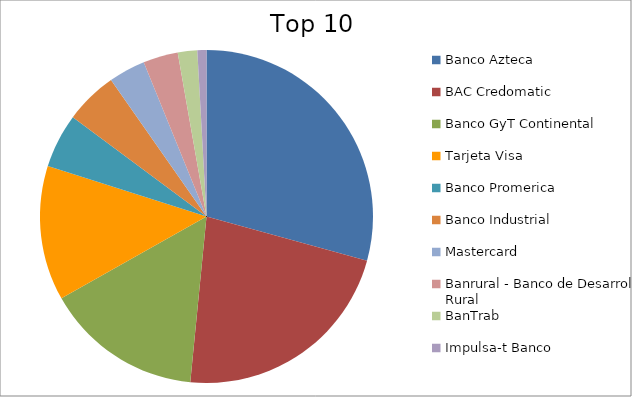
| Category | Series 0 |
|---|---|
| Banco Azteca | 29.27 |
| BAC Credomatic | 22.28 |
| Banco GyT Continental | 15.28 |
| Tarjeta Visa | 13.06 |
| Banco Promerica | 5.27 |
| Banco Industrial | 5.11 |
| Mastercard | 3.57 |
| Banrural - Banco de Desarrollo Rural | 3.38 |
| BanTrab | 1.89 |
| Impulsa-t Banco | 0.88 |